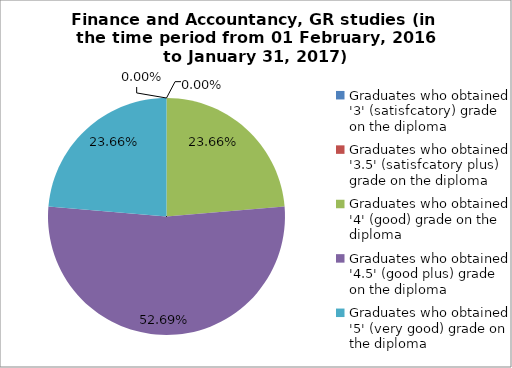
| Category | Series 0 |
|---|---|
| Graduates who obtained '3' (satisfcatory) grade on the diploma | 0 |
| Graduates who obtained '3.5' (satisfcatory plus) grade on the diploma | 0 |
| Graduates who obtained '4' (good) grade on the diploma | 23.656 |
| Graduates who obtained '4.5' (good plus) grade on the diploma | 52.688 |
| Graduates who obtained '5' (very good) grade on the diploma | 23.656 |